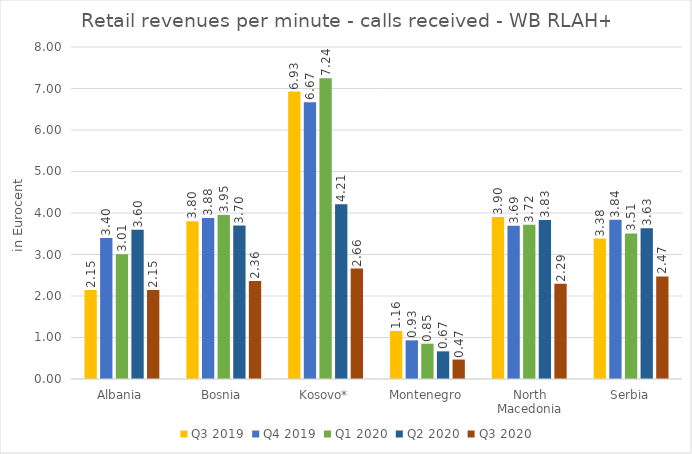
| Category | Q3 2019 | Q4 2019 | Q1 2020 | Q2 2020 | Q3 2020 |
|---|---|---|---|---|---|
| Albania | 2.146 | 3.398 | 3.007 | 3.596 | 2.147 |
| Bosnia | 3.802 | 3.882 | 3.953 | 3.696 | 2.359 |
| Kosovo* | 6.927 | 6.666 | 7.245 | 4.214 | 2.66 |
| Montenegro | 1.158 | 0.931 | 0.851 | 0.667 | 0.468 |
| North Macedonia | 3.904 | 3.693 | 3.715 | 3.828 | 2.294 |
| Serbia | 3.383 | 3.837 | 3.508 | 3.635 | 2.472 |